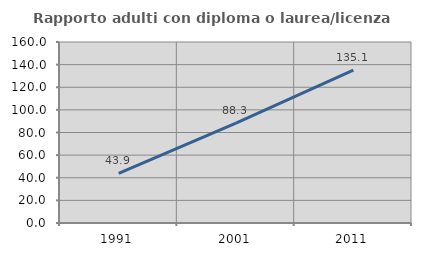
| Category | Rapporto adulti con diploma o laurea/licenza media  |
|---|---|
| 1991.0 | 43.902 |
| 2001.0 | 88.337 |
| 2011.0 | 135.053 |